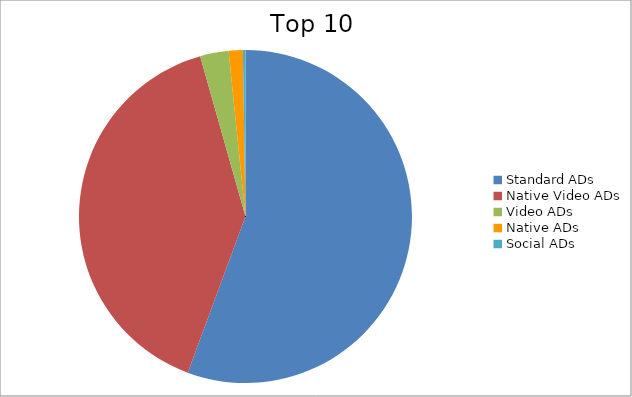
| Category | Series 0 |
|---|---|
| Standard ADs | 55.64 |
| Native Video ADs | 39.97 |
| Video ADs | 2.77 |
| Native ADs | 1.37 |
| Social ADs | 0.25 |